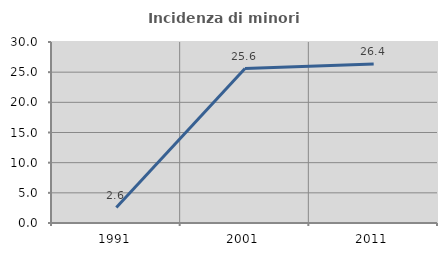
| Category | Incidenza di minori stranieri |
|---|---|
| 1991.0 | 2.564 |
| 2001.0 | 25.592 |
| 2011.0 | 26.351 |